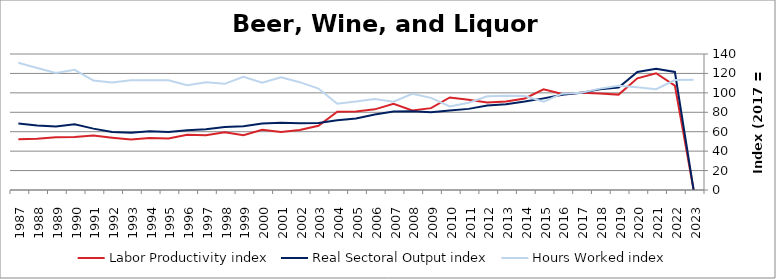
| Category | Labor Productivity index | Real Sectoral Output index | Hours Worked index |
|---|---|---|---|
| 2023.0 | 0 | 0 | 113.527 |
| 2022.0 | 107.42 | 121.529 | 113.134 |
| 2021.0 | 120.195 | 124.788 | 103.821 |
| 2020.0 | 114.932 | 121.514 | 105.727 |
| 2019.0 | 98.198 | 105.479 | 107.415 |
| 2018.0 | 99.423 | 103.761 | 104.363 |
| 2017.0 | 100 | 100 | 100 |
| 2016.0 | 98.752 | 97.96 | 99.198 |
| 2015.0 | 103.698 | 94.322 | 90.958 |
| 2014.0 | 94.247 | 91.121 | 96.683 |
| 2013.0 | 91.025 | 88.383 | 97.097 |
| 2012.0 | 90.131 | 86.886 | 96.399 |
| 2011.0 | 93.001 | 83.511 | 89.796 |
| 2010.0 | 95.314 | 81.932 | 85.96 |
| 2009.0 | 84.262 | 79.915 | 94.841 |
| 2008.0 | 81.781 | 81.02 | 99.069 |
| 2007.0 | 88.828 | 80.683 | 90.83 |
| 2006.0 | 83.02 | 77.802 | 93.715 |
| 2005.0 | 80.927 | 73.68 | 91.045 |
| 2004.0 | 80.68 | 71.707 | 88.878 |
| 2003.0 | 66.122 | 69.042 | 104.417 |
| 2002.0 | 61.806 | 68.604 | 110.999 |
| 2001.0 | 59.774 | 69.338 | 116.001 |
| 2000.0 | 61.964 | 68.374 | 110.345 |
| 1999.0 | 56.331 | 65.647 | 116.537 |
| 1998.0 | 59.426 | 64.952 | 109.298 |
| 1997.0 | 56.356 | 62.472 | 110.853 |
| 1996.0 | 56.907 | 61.441 | 107.968 |
| 1995.0 | 52.929 | 59.751 | 112.889 |
| 1994.0 | 53.499 | 60.39 | 112.88 |
| 1993.0 | 52.005 | 58.817 | 113.099 |
| 1992.0 | 53.851 | 59.642 | 110.754 |
| 1991.0 | 56.092 | 63.184 | 112.642 |
| 1990.0 | 54.676 | 67.623 | 123.679 |
| 1989.0 | 54.293 | 65.429 | 120.51 |
| 1988.0 | 52.778 | 66.276 | 125.575 |
| 1987.0 | 52.214 | 68.425 | 131.048 |